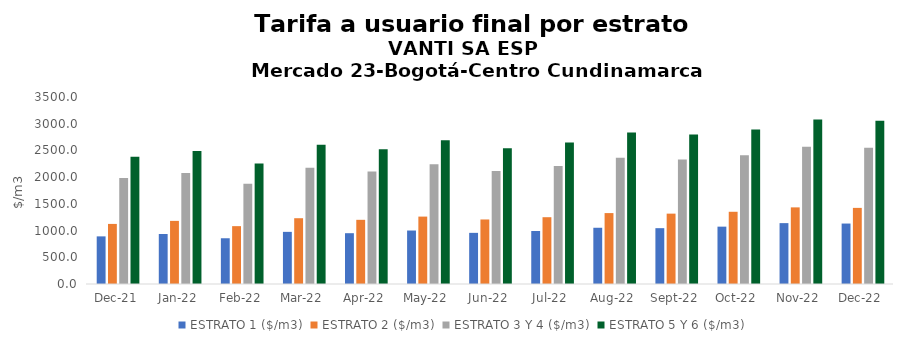
| Category | ESTRATO 1 ($/m3) | ESTRATO 2 ($/m3) | ESTRATO 3 Y 4 ($/m3) | ESTRATO 5 Y 6 ($/m3) |
|---|---|---|---|---|
| 2021-12-01 | 891.31 | 1124.51 | 1985.81 | 2382.972 |
| 2022-01-01 | 935.58 | 1181.34 | 2075.8 | 2490.96 |
| 2022-02-01 | 856.19 | 1082.91 | 1878.66 | 2254.392 |
| 2022-03-01 | 975.85 | 1231.21 | 2173.48 | 2608.176 |
| 2022-04-01 | 950.89 | 1201.22 | 2103.49 | 2524.188 |
| 2022-05-01 | 1000.88 | 1261.58 | 2243.11 | 2691.732 |
| 2022-06-01 | 957.2 | 1207.84 | 2116.44 | 2539.728 |
| 2022-07-01 | 991.75 | 1250.14 | 2206.55 | 2647.86 |
| 2022-08-01 | 1052.6 | 1327.26 | 2361.3 | 2833.56 |
| 2022-09-01 | 1044.96 | 1317 | 2332 | 2798.4 |
| 2022-10-01 | 1073.46 | 1351.82 | 2408.2 | 2889.84 |
| 2022-11-01 | 1139.35 | 1434.14 | 2567.61 | 3081.132 |
| 2022-12-01 | 1131.49 | 1424.62 | 2548.14 | 3057.768 |